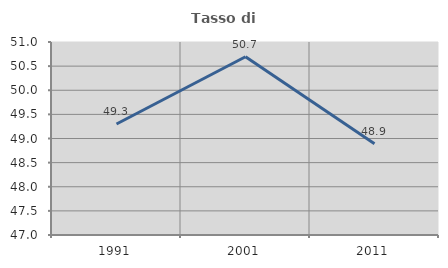
| Category | Tasso di occupazione   |
|---|---|
| 1991.0 | 49.301 |
| 2001.0 | 50.694 |
| 2011.0 | 48.891 |